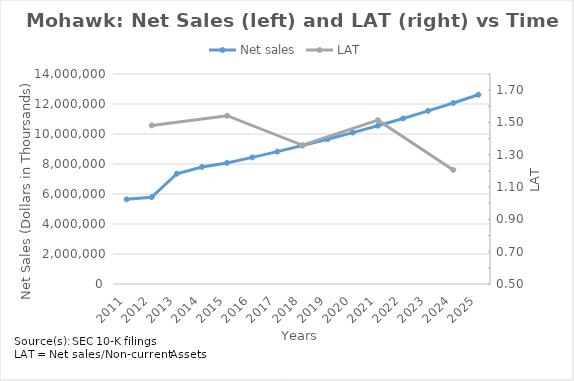
| Category | Net sales |
|---|---|
| 2011 | 5642258 |
| 2012 | 5787980 |
| 2013 | 7348754 |
| 2014 | 7803446 |
| 2015 | 8071563 |
| 2016 | 8440471.531 |
| 2017 | 8826240.923 |
| 2018 | 9229641.797 |
| 2019 | 9651479.996 |
| 2020 | 10092598.191 |
| 2021 | 10553877.57 |
| 2022 | 11036239.595 |
| 2023 | 11540647.84 |
| 2024 | 12068109.924 |
| 2025 | 12619679.515 |